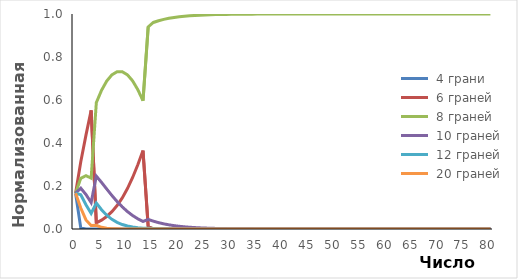
| Category |  4 грани |  6 граней |  8 граней |  10 граней |  12 граней |  20 граней |
|---|---|---|---|---|---|---|
| 0.0 | 0.167 | 0.167 | 0.167 | 0.167 | 0.167 | 0.167 |
| 1.0 | 0.005 | 0.313 | 0.236 | 0.19 | 0.159 | 0.097 |
| 2.0 | 0 | 0.437 | 0.248 | 0.16 | 0.113 | 0.042 |
| 3.0 | 0 | 0.552 | 0.236 | 0.123 | 0.072 | 0.017 |
| 4.0 | 0 | 0.028 | 0.588 | 0.246 | 0.121 | 0.017 |
| 5.0 | 0 | 0.041 | 0.645 | 0.217 | 0.089 | 0.008 |
| 6.0 | 0 | 0.058 | 0.688 | 0.186 | 0.064 | 0.003 |
| 7.0 | 0 | 0.081 | 0.717 | 0.156 | 0.045 | 0.001 |
| 8.0 | 0 | 0.109 | 0.732 | 0.128 | 0.031 | 0.001 |
| 9.0 | 0 | 0.145 | 0.731 | 0.103 | 0.021 | 0 |
| 10.0 | 0 | 0.188 | 0.717 | 0.081 | 0.014 | 0 |
| 11.0 | 0 | 0.24 | 0.689 | 0.063 | 0.009 | 0 |
| 12.0 | 0 | 0.299 | 0.648 | 0.047 | 0.006 | 0 |
| 13.0 | 0 | 0.365 | 0.597 | 0.035 | 0.004 | 0 |
| 14.0 | 0 | 0.012 | 0.94 | 0.044 | 0.004 | 0 |
| 15.0 | 0 | 0 | 0.961 | 0.037 | 0.003 | 0 |
| 16.0 | 0 | 0 | 0.968 | 0.03 | 0.002 | 0 |
| 17.0 | 0 | 0 | 0.975 | 0.024 | 0.001 | 0 |
| 18.0 | 0 | 0 | 0.98 | 0.019 | 0.001 | 0 |
| 19.0 | 0 | 0 | 0.984 | 0.016 | 0.001 | 0 |
| 20.0 | 0 | 0 | 0.987 | 0.013 | 0 | 0 |
| 21.0 | 0 | 0 | 0.99 | 0.01 | 0 | 0 |
| 22.0 | 0 | 0 | 0.992 | 0.008 | 0 | 0 |
| 23.0 | 0 | 0 | 0.993 | 0.007 | 0 | 0 |
| 24.0 | 0 | 0 | 0.995 | 0.005 | 0 | 0 |
| 25.0 | 0 | 0 | 0.996 | 0.004 | 0 | 0 |
| 26.0 | 0 | 0 | 0.997 | 0.003 | 0 | 0 |
| 27.0 | 0 | 0 | 0.997 | 0.003 | 0 | 0 |
| 28.0 | 0 | 0 | 0.998 | 0.002 | 0 | 0 |
| 29.0 | 0 | 0 | 0.998 | 0.002 | 0 | 0 |
| 30.0 | 0 | 0 | 0.999 | 0.001 | 0 | 0 |
| 31.0 | 0 | 0 | 0.999 | 0.001 | 0 | 0 |
| 32.0 | 0 | 0 | 0.999 | 0.001 | 0 | 0 |
| 33.0 | 0 | 0 | 0.999 | 0.001 | 0 | 0 |
| 34.0 | 0 | 0 | 0.999 | 0.001 | 0 | 0 |
| 35.0 | 0 | 0 | 1 | 0 | 0 | 0 |
| 36.0 | 0 | 0 | 1 | 0 | 0 | 0 |
| 37.0 | 0 | 0 | 1 | 0 | 0 | 0 |
| 38.0 | 0 | 0 | 1 | 0 | 0 | 0 |
| 39.0 | 0 | 0 | 1 | 0 | 0 | 0 |
| 40.0 | 0 | 0 | 1 | 0 | 0 | 0 |
| 41.0 | 0 | 0 | 1 | 0 | 0 | 0 |
| 42.0 | 0 | 0 | 1 | 0 | 0 | 0 |
| 43.0 | 0 | 0 | 1 | 0 | 0 | 0 |
| 44.0 | 0 | 0 | 1 | 0 | 0 | 0 |
| 45.0 | 0 | 0 | 1 | 0 | 0 | 0 |
| 46.0 | 0 | 0 | 1 | 0 | 0 | 0 |
| 47.0 | 0 | 0 | 1 | 0 | 0 | 0 |
| 48.0 | 0 | 0 | 1 | 0 | 0 | 0 |
| 49.0 | 0 | 0 | 1 | 0 | 0 | 0 |
| 50.0 | 0 | 0 | 1 | 0 | 0 | 0 |
| 51.0 | 0 | 0 | 1 | 0 | 0 | 0 |
| 52.0 | 0 | 0 | 1 | 0 | 0 | 0 |
| 53.0 | 0 | 0 | 1 | 0 | 0 | 0 |
| 54.0 | 0 | 0 | 1 | 0 | 0 | 0 |
| 55.0 | 0 | 0 | 1 | 0 | 0 | 0 |
| 56.0 | 0 | 0 | 1 | 0 | 0 | 0 |
| 57.0 | 0 | 0 | 1 | 0 | 0 | 0 |
| 58.0 | 0 | 0 | 1 | 0 | 0 | 0 |
| 59.0 | 0 | 0 | 1 | 0 | 0 | 0 |
| 60.0 | 0 | 0 | 1 | 0 | 0 | 0 |
| 61.0 | 0 | 0 | 1 | 0 | 0 | 0 |
| 62.0 | 0 | 0 | 1 | 0 | 0 | 0 |
| 63.0 | 0 | 0 | 1 | 0 | 0 | 0 |
| 64.0 | 0 | 0 | 1 | 0 | 0 | 0 |
| 65.0 | 0 | 0 | 1 | 0 | 0 | 0 |
| 66.0 | 0 | 0 | 1 | 0 | 0 | 0 |
| 67.0 | 0 | 0 | 1 | 0 | 0 | 0 |
| 68.0 | 0 | 0 | 1 | 0 | 0 | 0 |
| 69.0 | 0 | 0 | 1 | 0 | 0 | 0 |
| 70.0 | 0 | 0 | 1 | 0 | 0 | 0 |
| 71.0 | 0 | 0 | 1 | 0 | 0 | 0 |
| 72.0 | 0 | 0 | 1 | 0 | 0 | 0 |
| 73.0 | 0 | 0 | 1 | 0 | 0 | 0 |
| 74.0 | 0 | 0 | 1 | 0 | 0 | 0 |
| 75.0 | 0 | 0 | 1 | 0 | 0 | 0 |
| 76.0 | 0 | 0 | 1 | 0 | 0 | 0 |
| 77.0 | 0 | 0 | 1 | 0 | 0 | 0 |
| 78.0 | 0 | 0 | 1 | 0 | 0 | 0 |
| 79.0 | 0 | 0 | 1 | 0 | 0 | 0 |
| 80.0 | 0 | 0 | 1 | 0 | 0 | 0 |